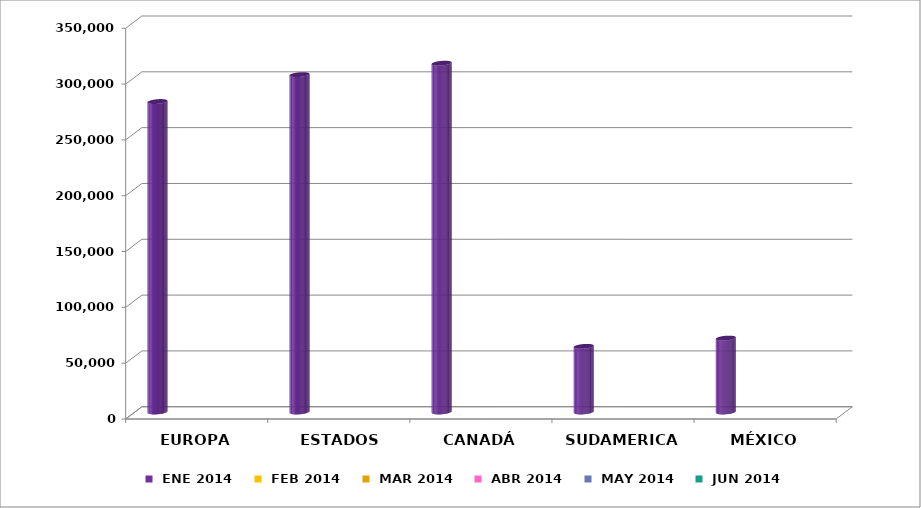
| Category |  ENE 2014 |  FEB 2014 |  MAR 2014 |  ABR 2014 |  MAY 2014 |  JUN 2014 |
|---|---|---|---|---|---|---|
| EUROPA | 278085 |  |  |  |  |  |
| ESTADOS UNIDOS | 302180 |  |  |  |  |  |
| CANADÁ | 312447 |  |  |  |  |  |
| SUDAMERICA | 58797 |  |  |  |  |  |
| MÉXICO | 66195 |  |  |  |  |  |